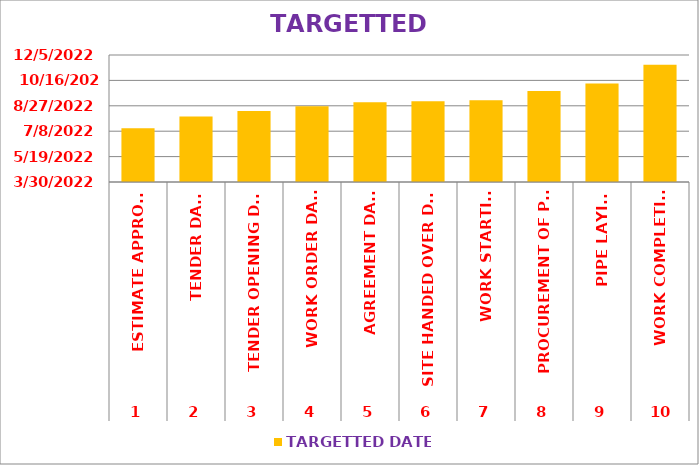
| Category | TARGETTED DATE |
|---|---|
| 0 | 7/14/22 |
| 1 | 8/6/22 |
| 2 | 8/17/22 |
| 3 | 8/26/22 |
| 4 | 9/3/22 |
| 5 | 9/5/22 |
| 6 | 9/7/22 |
| 7 | 9/25/22 |
| 8 | 10/10/22 |
| 9 | 11/16/22 |